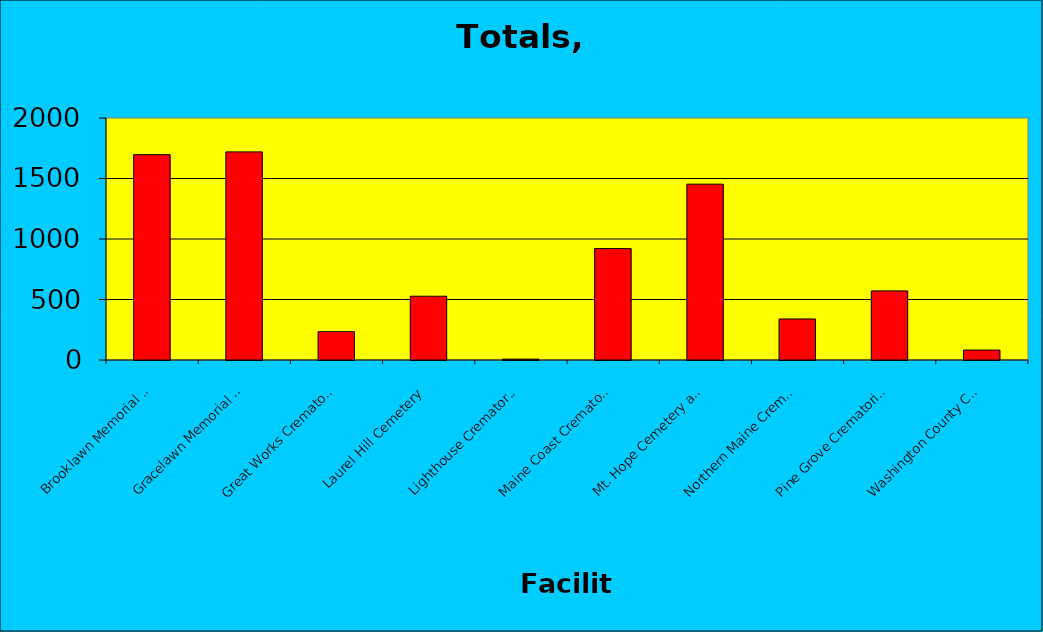
| Category | YTD |
|---|---|
| Brooklawn Memorial Park | 1697 |
| Gracelawn Memorial Park | 1720 |
| Great Works Crematory* | 234 |
| Laurel Hill Cemetery | 527 |
| Lighthouse Crematory & Rembrance Center** | 7 |
| Maine Coast Crematory | 921 |
| Mt. Hope Cemetery and Crematory | 1453 |
| Northern Maine Crematory | 339 |
| Pine Grove Crematorium | 571 |
| Washington County Crematorium*** | 82 |